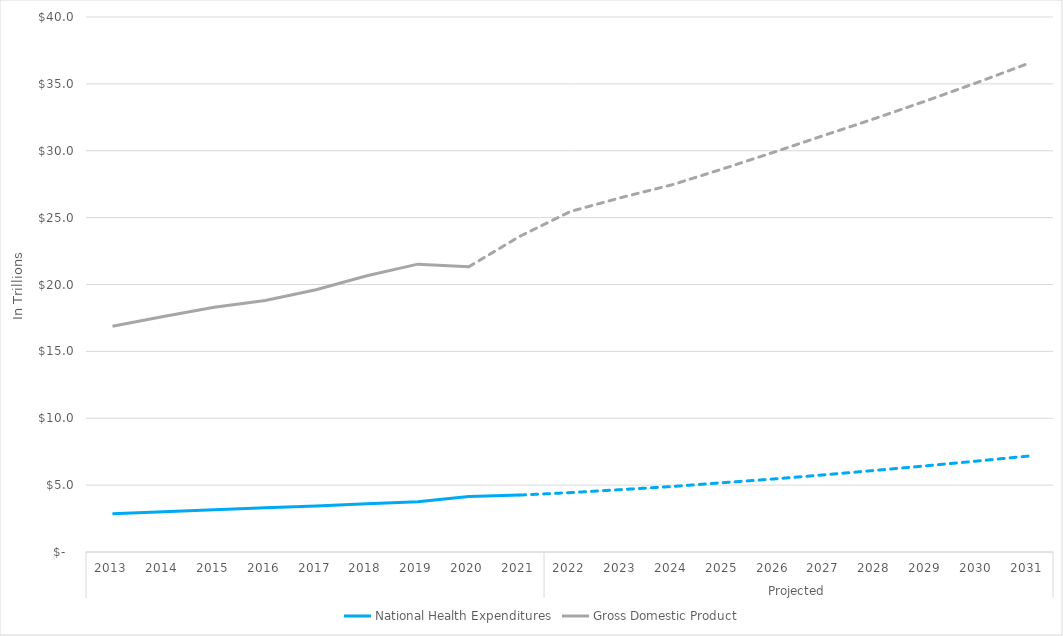
| Category | National Health Expenditures | Gross Domestic Product |
|---|---|---|
| 0 | 2.857 | 16.881 |
| 1 | 3.003 | 17.608 |
| 2 | 3.165 | 18.295 |
| 3 | 3.307 | 18.805 |
| 4 | 3.446 | 19.612 |
| 5 | 3.604 | 20.656 |
| 6 | 3.757 | 21.521 |
| 7 | 4.144 | 21.323 |
| 8 | 4.255 | 23.594 |
| 9 | 4.44 | 25.461 |
| 10 | 4.666 | 26.505 |
| 11 | 4.898 | 27.459 |
| 12 | 5.185 | 28.654 |
| 13 | 5.462 | 29.9 |
| 14 | 5.774 | 31.171 |
| 15 | 6.106 | 32.434 |
| 16 | 6.449 | 33.747 |
| 17 | 6.804 | 35.114 |
| 18 | 7.175 | 36.536 |